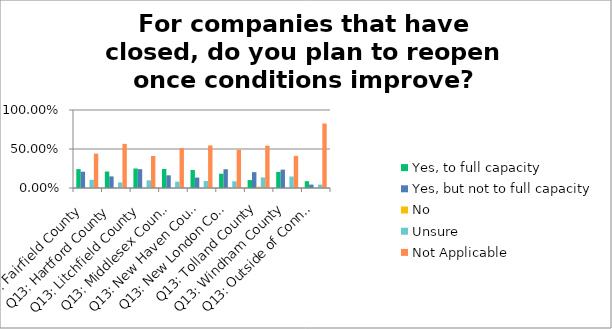
| Category | Yes, to full capacity | Yes, but not to full capacity | No | Unsure | Not Applicable |
|---|---|---|---|---|---|
| Q13: Fairfield County | 0.242 | 0.209 | 0.002 | 0.106 | 0.441 |
| Q13: Hartford County | 0.211 | 0.149 | 0.003 | 0.071 | 0.566 |
| Q13: Litchfield County | 0.25 | 0.241 | 0 | 0.098 | 0.411 |
| Q13: Middlesex County | 0.244 | 0.163 | 0 | 0.081 | 0.512 |
| Q13: New Haven County | 0.231 | 0.134 | 0 | 0.089 | 0.546 |
| Q13: New London County | 0.183 | 0.24 | 0 | 0.087 | 0.49 |
| Q13: Tolland County | 0.102 | 0.203 | 0.017 | 0.136 | 0.542 |
| Q13: Windham County | 0.206 | 0.235 | 0 | 0.147 | 0.412 |
| Q13: Outside of Connecticut | 0.087 | 0.044 | 0 | 0.044 | 0.826 |